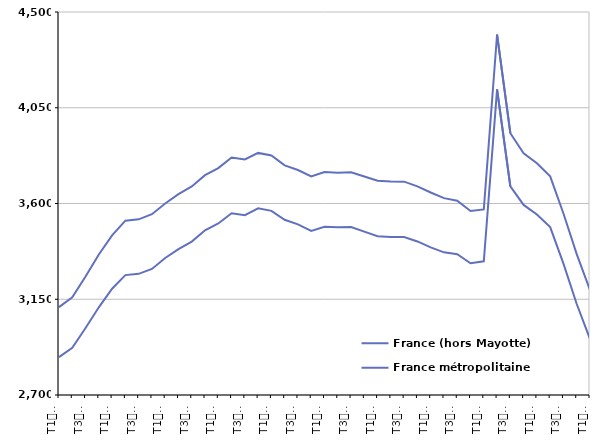
| Category | France (hors Mayotte) | France métropolitaine |
|---|---|---|
| T1
2012 | 3113 | 2878 |
| T2
2012 | 3159 | 2921.5 |
| T3
2012 | 3256.7 | 3014.6 |
| T4
2012 | 3360.1 | 3112.1 |
| T1
2013 | 3450.5 | 3199.3 |
| T2
2013 | 3519.4 | 3263.5 |
| T3
2013 | 3525.6 | 3269.5 |
| T4
2013 | 3549.6 | 3292.6 |
| T1
2014 | 3600.3 | 3343.8 |
| T2
2014 | 3643.8 | 3385.7 |
| T3
2014 | 3680.3 | 3421.1 |
| T4
2014 | 3733 | 3473.8 |
| T1
2015 | 3766.4 | 3506.3 |
| T2
2015 | 3816.5 | 3554.1 |
| T3
2015 | 3807 | 3545.1 |
| T4
2015 | 3837.8 | 3577.3 |
| T1
2016 | 3825.5 | 3565.5 |
| T2
2016 | 3779.2 | 3523.4 |
| T3
2016 | 3757.5 | 3501.9 |
| T4
2016 | 3727.7 | 3471.4 |
| T1
2017 | 3747.7 | 3490.5 |
| T2
2017 | 3744.5 | 3488.6 |
| T3
2017 | 3746.7 | 3489.7 |
| T4
2017 | 3727.1 | 3467.9 |
| T1
2018 | 3706.9 | 3446.5 |
| T2
2018 | 3703 | 3442.2 |
| T3
2018 | 3702.6 | 3442.3 |
| T4
2018 | 3680.6 | 3421.6 |
| T1
2019 | 3651.8 | 3393.7 |
| T2
2019 | 3625.1 | 3370.5 |
| T3
2019 | 3612.9 | 3361.8 |
| T4
2019 | 3564.9 | 3319 |
| T1
2020 | 3572.1 | 3328.5 |
| T2
2020 | 4394.2 | 4136.7 |
| T3
2020 | 3930.3 | 3680.5 |
| T4
2020 | 3836.3 | 3593.3 |
| T1
2021 | 3789.3 | 3548 |
| T2
2021 | 3727.7 | 3488.9 |
| T3
2021 | 3553 | 3317.3 |
| T4
2021 | 3361.9 | 3127.5 |
| T1
2022 | 3192.8 | 2962.8 |